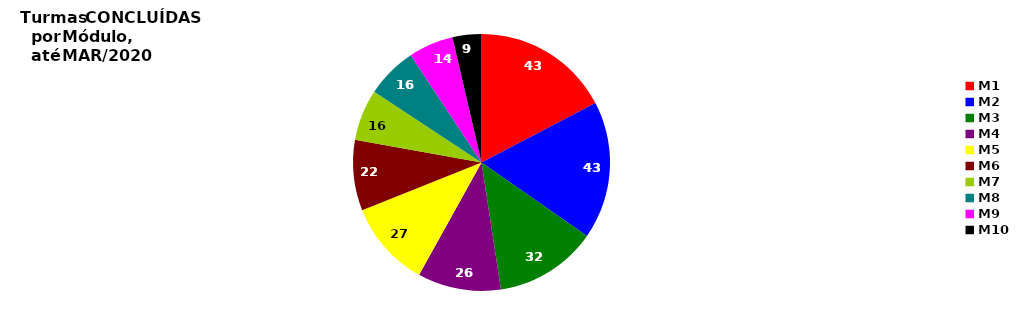
| Category | Series 0 |
|---|---|
| M1 | 43 |
| M2 | 43 |
| M3 | 32 |
| M4 | 26 |
| M5 | 27 |
| M6 | 22 |
| M7 | 16 |
| M8 | 16 |
| M9 | 14 |
| M10 | 9 |